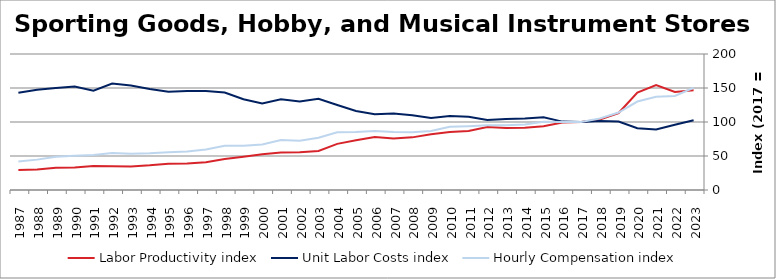
| Category | Labor Productivity index | Unit Labor Costs index | Hourly Compensation index |
|---|---|---|---|
| 2023.0 | 146.562 | 102.633 | 150.421 |
| 2022.0 | 144.288 | 95.846 | 138.294 |
| 2021.0 | 154.183 | 88.965 | 137.169 |
| 2020.0 | 143.372 | 90.751 | 130.111 |
| 2019.0 | 113.198 | 100.684 | 113.972 |
| 2018.0 | 103.577 | 101.55 | 105.182 |
| 2017.0 | 100 | 100 | 100 |
| 2016.0 | 99.261 | 100.574 | 99.831 |
| 2015.0 | 93.744 | 107.034 | 100.337 |
| 2014.0 | 91.675 | 105.096 | 96.347 |
| 2013.0 | 91.16 | 104.312 | 95.091 |
| 2012.0 | 92.464 | 102.859 | 95.108 |
| 2011.0 | 86.851 | 107.877 | 93.693 |
| 2010.0 | 85.396 | 108.717 | 92.84 |
| 2009.0 | 82.038 | 105.952 | 86.921 |
| 2008.0 | 77.401 | 109.871 | 85.041 |
| 2007.0 | 75.921 | 112.458 | 85.379 |
| 2006.0 | 77.89 | 111.304 | 86.695 |
| 2005.0 | 73.245 | 116.317 | 85.197 |
| 2004.0 | 67.857 | 124.999 | 84.821 |
| 2003.0 | 57.392 | 134.117 | 76.973 |
| 2002.0 | 55.636 | 130.202 | 72.439 |
| 2001.0 | 55.035 | 133.403 | 73.419 |
| 2000.0 | 52.619 | 127.42 | 67.047 |
| 1999.0 | 48.815 | 133.422 | 65.13 |
| 1998.0 | 45.436 | 143.434 | 65.171 |
| 1997.0 | 40.796 | 145.701 | 59.44 |
| 1996.0 | 38.885 | 145.549 | 56.597 |
| 1995.0 | 38.568 | 144.375 | 55.682 |
| 1994.0 | 36.316 | 148.666 | 53.989 |
| 1993.0 | 34.71 | 153.637 | 53.327 |
| 1992.0 | 34.771 | 156.518 | 54.424 |
| 1991.0 | 35.348 | 145.951 | 51.591 |
| 1990.0 | 33.15 | 152.18 | 50.448 |
| 1989.0 | 32.617 | 150.107 | 48.96 |
| 1988.0 | 30.286 | 147.5 | 44.671 |
| 1987.0 | 29.276 | 142.872 | 41.827 |